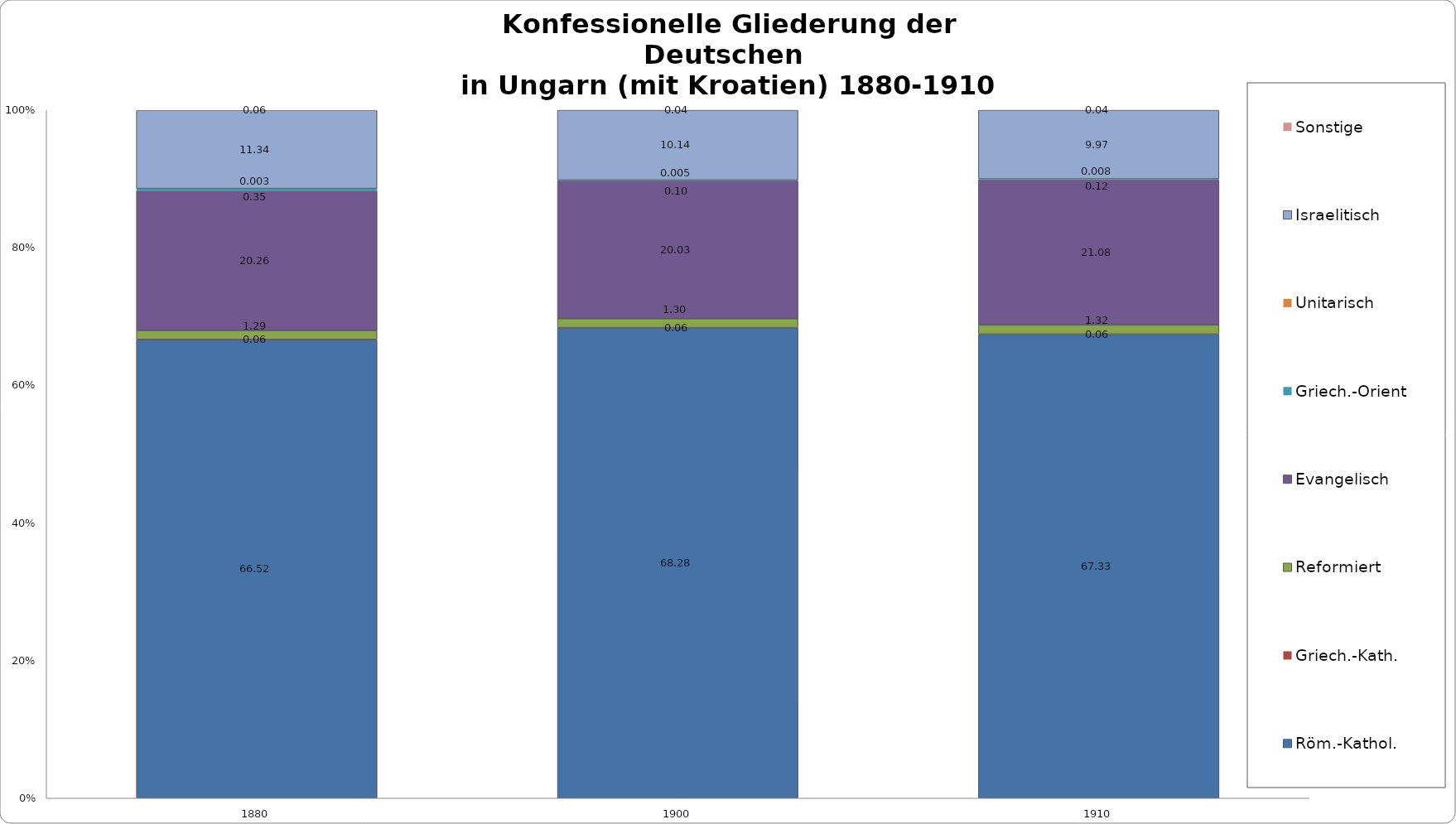
| Category | Röm.-Kathol. | Griech.-Kath. | Reformiert | Evangelisch | Griech.-Orient | Unitarisch | Israelitisch | Sonstige |
|---|---|---|---|---|---|---|---|---|
| 1880.0 | 66.52 | 0.06 | 1.29 | 20.26 | 0.35 | 0.003 | 11.34 | 0.06 |
| 1900.0 | 68.28 | 0.06 | 1.3 | 20.03 | 0.1 | 0.005 | 10.14 | 0.04 |
| 1910.0 | 67.33 | 0.06 | 1.32 | 21.08 | 0.12 | 0.008 | 9.97 | 0.04 |